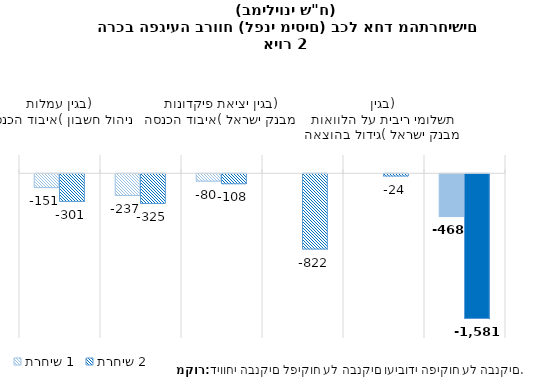
| Category | תרחיש 1 | תרחיש 2 |
|---|---|---|
| בגין עמלות ניהול חשבון (איבוד הכנסה) | -150.714 | -301.428 |
| בגין העלאת ריבית על הפיקדונות (גידול בהוצאה) | -236.735 | -324.93 |
| בגין יציאת פיקדונות מבנק ישראל (איבוד הכנסה) | -80.181 | -108.244 |
| בגין תשלומי אג"ח (גידול בהוצאה) | 0 | -822.324 |
| בגין תשלומי ריבית על הלוואות מבנק ישראל (גידול בהוצאה) | 0 | -24.054 |
| סך ההפסד | -467.629 | -1580.98 |